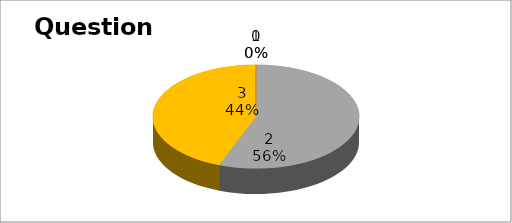
| Category | Series 0 |
|---|---|
| 0 | 0 |
| 1 | 0 |
| 2 | 53 |
| 3 | 42 |